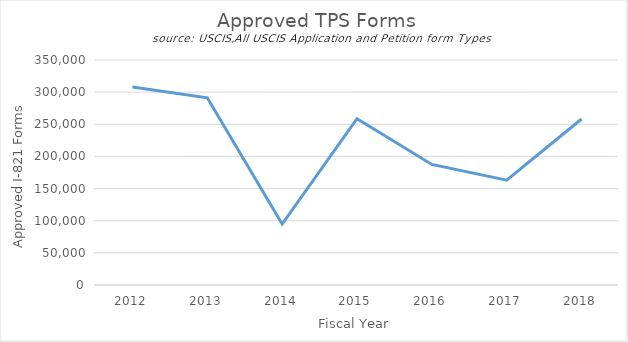
| Category | Approved TPS Forms |
|---|---|
| 2012.0 | 308062 |
| 2013.0 | 291258 |
| 2014.0 | 94837 |
| 2015.0 | 258722 |
| 2016.0 | 187521 |
| 2017.0 | 163093 |
| 2018.0 | 258275 |